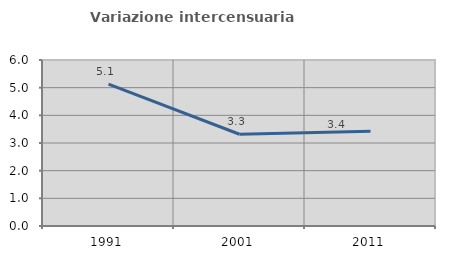
| Category | Variazione intercensuaria annua |
|---|---|
| 1991.0 | 5.128 |
| 2001.0 | 3.316 |
| 2011.0 | 3.427 |